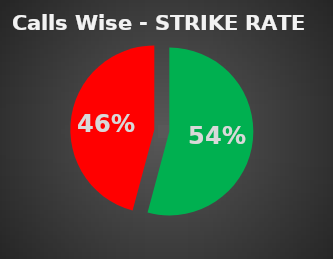
| Category | Series 0 |
|---|---|
| 0 | 0.542 |
| 1 | 0.458 |